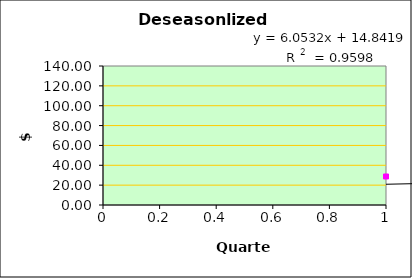
| Category | Sales (Yd) |
|---|---|
| 0 | 28.711 |
| 1 | 30.811 |
| 2 | 35.008 |
| 3 | 41.183 |
| 4 | 44.79 |
| 5 | 48.417 |
| 6 | 55.012 |
| 7 | 57.656 |
| 8 | 59.72 |
| 9 | 66.023 |
| 10 | 77.017 |
| 11 | 82.366 |
| 12 | 97.618 |
| 13 | 110.038 |
| 14 | 111.024 |
| 15 | 115.312 |